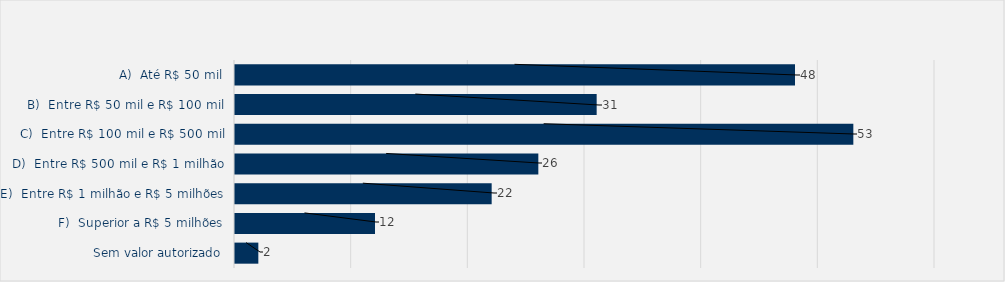
| Category | Total |
|---|---|
| A)  Até R$ 50 mil | 48 |
| B)  Entre R$ 50 mil e R$ 100 mil | 31 |
| C)  Entre R$ 100 mil e R$ 500 mil | 53 |
| D)  Entre R$ 500 mil e R$ 1 milhão | 26 |
| E)  Entre R$ 1 milhão e R$ 5 milhões | 22 |
| F)  Superior a R$ 5 milhões | 12 |
| Sem valor autorizado | 2 |